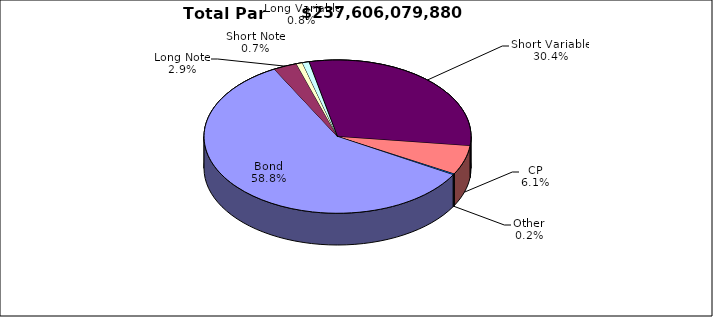
| Category | Par Value |
|---|---|
| Bond | 139751530420 |
| Long Note | 6805857555 |
| Short Note | 1778339042 |
| Long Variable | 1948393000 |
| Short Variable | 72162060433 |
| CP | 14596141000 |
| Other | 563758430 |